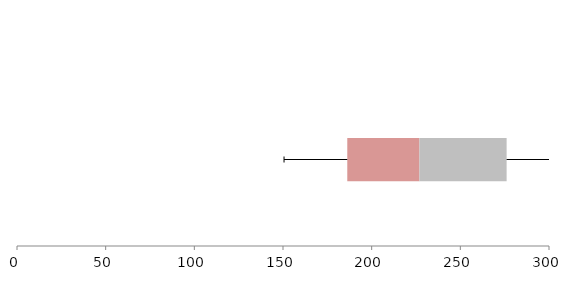
| Category | Series 1 | Series 2 | Series 3 |
|---|---|---|---|
| 0 | 186.248 | 40.68 | 49.175 |